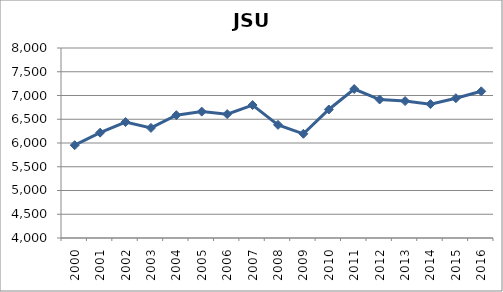
| Category | Series 0 |
|---|---|
| 2000.0 | 5953.542 |
| 2001.0 | 6217.875 |
| 2002.0 | 6441.367 |
| 2003.0 | 6317.633 |
| 2004.0 | 6586.217 |
| 2005.0 | 6660.542 |
| 2006.0 | 6607.904 |
| 2007.0 | 6798.55 |
| 2008.0 | 6381.883 |
| 2009.0 | 6193.721 |
| 2010.0 | 6705.421 |
| 2011.0 | 7136.892 |
| 2012.0 | 6915.417 |
| 2013.0 | 6883.233 |
| 2014.0 | 6818.562 |
| 2015.0 | 6942.846 |
| 2016.0 | 7087.95 |